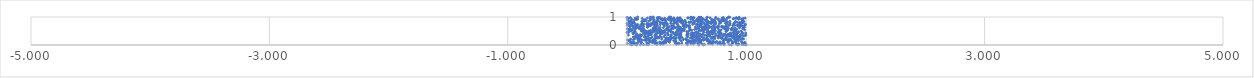
| Category | Series 0 |
|---|---|
| 0.6395549187252131 | 0.001 |
| 0.9310848672716872 | 0.002 |
| 0.9982187276434067 | 0.003 |
| 0.6012883840507545 | 0.004 |
| 0.04014197229621019 | 0.005 |
| 0.8748507245919236 | 0.006 |
| 0.08088517814818463 | 0.007 |
| 0.8154413860012517 | 0.008 |
| 0.8605284118616594 | 0.009 |
| 0.07628825915491433 | 0.01 |
| 0.11141022182324822 | 0.011 |
| 0.5068996280072336 | 0.012 |
| 0.1648344174627362 | 0.013 |
| 0.9665744751295906 | 0.014 |
| 0.1382032721908052 | 0.015 |
| 0.04223442895374796 | 0.016 |
| 0.18097360829767317 | 0.017 |
| 0.9742194430497847 | 0.018 |
| 0.9960851772762854 | 0.019 |
| 0.9811782340766644 | 0.02 |
| 0.6496849309165537 | 0.021 |
| 0.9193569184805348 | 0.022 |
| 0.25334508138845135 | 0.023 |
| 0.02981359307184772 | 0.024 |
| 0.7851436814782091 | 0.025 |
| 0.2807134976208202 | 0.026 |
| 0.9391021248131862 | 0.027 |
| 0.3016175500622472 | 0.028 |
| 0.9773512443753082 | 0.029 |
| 0.07931502166857785 | 0.03 |
| 0.556216024078836 | 0.031 |
| 0.4194814433675026 | 0.032 |
| 0.715975852775206 | 0.033 |
| 0.06179237089372924 | 0.034 |
| 0.9683378387305361 | 0.035 |
| 0.4139801656038691 | 0.036 |
| 0.25037345745661665 | 0.037 |
| 0.049797369471484165 | 0.038 |
| 0.41332417344475536 | 0.039 |
| 0.5988523106841044 | 0.04 |
| 0.7608491718158467 | 0.041 |
| 0.04943939275445175 | 0.042 |
| 0.7973265641790036 | 0.043 |
| 0.4375115468829375 | 0.044 |
| 0.9329117260293902 | 0.045 |
| 0.23537873245244534 | 0.046 |
| 0.5352460393366723 | 0.047 |
| 0.715892489913357 | 0.048 |
| 0.002405218209851512 | 0.049 |
| 0.6859869116301182 | 0.05 |
| 0.1783027727551455 | 0.051 |
| 0.4078578606921214 | 0.052 |
| 0.8141199057326022 | 0.053 |
| 0.8846974862135012 | 0.054 |
| 0.6252510479841711 | 0.055 |
| 0.28819809942706165 | 0.056 |
| 0.8139209923007339 | 0.057 |
| 0.9694759012288868 | 0.058 |
| 0.7700459021245795 | 0.059 |
| 0.9724609045760437 | 0.06 |
| 0.23368429750318487 | 0.061 |
| 0.5942851697361076 | 0.062 |
| 0.6861573832308311 | 0.063 |
| 0.7048602059146223 | 0.064 |
| 0.45990905691922024 | 0.065 |
| 0.7053683677320601 | 0.066 |
| 0.9149765791785728 | 0.067 |
| 0.4968846486621923 | 0.068 |
| 0.280671708900336 | 0.069 |
| 0.9735447370580133 | 0.07 |
| 0.43087415789896577 | 0.071 |
| 0.0594187252914663 | 0.072 |
| 0.25197872444667224 | 0.073 |
| 0.08868910783655104 | 0.074 |
| 0.25234228503677814 | 0.075 |
| 0.31300521075153687 | 0.076 |
| 0.7740774423209505 | 0.077 |
| 0.8861991284111324 | 0.078 |
| 0.7774398371507889 | 0.079 |
| 0.16489169406309057 | 0.08 |
| 0.2943854967665104 | 0.081 |
| 0.5676430077436584 | 0.082 |
| 0.32515032120642584 | 0.083 |
| 0.031074622306497268 | 0.084 |
| 0.12279866285688767 | 0.085 |
| 0.7023080361508347 | 0.086 |
| 0.9869063489259365 | 0.087 |
| 0.4039398090758105 | 0.088 |
| 0.30519437286142115 | 0.089 |
| 0.9884308449080533 | 0.09 |
| 0.5106777248199883 | 0.091 |
| 0.21135115733213328 | 0.092 |
| 0.061466796960240266 | 0.093 |
| 0.8878564232653134 | 0.094 |
| 0.41182504077114135 | 0.095 |
| 0.3094026853496852 | 0.096 |
| 0.7423342141507401 | 0.097 |
| 0.11786290024941193 | 0.098 |
| 0.8463682304805973 | 0.099 |
| 0.05300553476225556 | 0.1 |
| 0.7368297410736497 | 0.101 |
| 0.5109250226090711 | 0.102 |
| 0.3564816763772468 | 0.103 |
| 0.7114793620909686 | 0.104 |
| 0.6175359919448731 | 0.105 |
| 0.9620550851207817 | 0.106 |
| 0.8491052324481466 | 0.107 |
| 0.2754342731209991 | 0.108 |
| 0.19337030178288273 | 0.109 |
| 0.30539739466167726 | 0.11 |
| 0.35306547610450967 | 0.111 |
| 0.7118813021916045 | 0.112 |
| 0.7803495675415976 | 0.113 |
| 0.7220844024835547 | 0.114 |
| 0.532748150097891 | 0.115 |
| 0.9159408477509404 | 0.116 |
| 0.8067779688069894 | 0.117 |
| 0.21524758409457956 | 0.118 |
| 0.23174501253191493 | 0.119 |
| 0.3547256039503738 | 0.12 |
| 0.03219751268669391 | 0.121 |
| 0.6103386769420509 | 0.122 |
| 0.5231799574935321 | 0.123 |
| 0.548172980986583 | 0.124 |
| 0.7527509322401276 | 0.125 |
| 0.3294980982583624 | 0.126 |
| 0.5589251221622763 | 0.127 |
| 0.6933793474768469 | 0.128 |
| 0.3147374457022064 | 0.129 |
| 0.5406324346796556 | 0.13 |
| 0.21650408556395828 | 0.131 |
| 0.5799422404948353 | 0.132 |
| 0.9608470414033518 | 0.133 |
| 0.09949658123151439 | 0.134 |
| 0.22253961588362048 | 0.135 |
| 0.9043498555629229 | 0.136 |
| 0.4082000097416266 | 0.137 |
| 0.7226346786462091 | 0.138 |
| 0.020839868958012264 | 0.139 |
| 0.8070385898737849 | 0.14 |
| 0.32272468908206287 | 0.141 |
| 0.5612216478253415 | 0.142 |
| 0.10154760366380211 | 0.143 |
| 0.4564234341331902 | 0.144 |
| 0.6715439479526928 | 0.145 |
| 0.6215065034940336 | 0.146 |
| 0.8502632109030541 | 0.147 |
| 0.8775179788591432 | 0.148 |
| 0.5241679415987878 | 0.149 |
| 0.6905350320056689 | 0.15 |
| 0.3361386562967804 | 0.151 |
| 0.19055941271391774 | 0.152 |
| 0.23973261017425318 | 0.153 |
| 0.10256186760070551 | 0.154 |
| 0.1622226207948091 | 0.155 |
| 0.39134894498145234 | 0.156 |
| 0.21399374323488052 | 0.157 |
| 0.014785502257189775 | 0.158 |
| 0.5061539633591291 | 0.159 |
| 0.5970062077557133 | 0.16 |
| 0.31891323975442076 | 0.161 |
| 0.40433006447718445 | 0.162 |
| 0.16000951553755238 | 0.163 |
| 0.18020148001281855 | 0.164 |
| 0.9377267813952599 | 0.165 |
| 0.5056831728019332 | 0.166 |
| 0.6178578179905749 | 0.167 |
| 0.8597505225674107 | 0.168 |
| 0.8423755069957324 | 0.169 |
| 0.5106485857013747 | 0.17 |
| 0.21847388606411255 | 0.171 |
| 0.643712223633878 | 0.172 |
| 0.6161869000522311 | 0.173 |
| 0.6773474360764032 | 0.174 |
| 0.12720496899049938 | 0.175 |
| 0.1444380950068771 | 0.176 |
| 0.9330021256906428 | 0.177 |
| 0.35343350241229865 | 0.178 |
| 0.849550740156674 | 0.179 |
| 0.9284493615800176 | 0.18 |
| 0.004393083375828666 | 0.181 |
| 0.0921628714469076 | 0.182 |
| 0.5711492717815835 | 0.183 |
| 0.6843904878303557 | 0.184 |
| 0.44350655122376936 | 0.185 |
| 0.8311952546558944 | 0.186 |
| 0.0530772209405862 | 0.187 |
| 0.9043024789936736 | 0.188 |
| 0.35778420451363957 | 0.189 |
| 0.36440882551868725 | 0.19 |
| 0.8488918863529484 | 0.191 |
| 0.8157814833670053 | 0.192 |
| 0.5518697218166232 | 0.193 |
| 0.6337168979686352 | 0.194 |
| 0.23209594073935536 | 0.195 |
| 0.6119743240124649 | 0.196 |
| 0.4963794970624189 | 0.197 |
| 0.47276269290726114 | 0.198 |
| 0.09278552612931501 | 0.199 |
| 0.9135477864355651 | 0.2 |
| 0.16173466297252914 | 0.201 |
| 0.8661479703523546 | 0.202 |
| 0.3644549566561549 | 0.203 |
| 0.22735941008024574 | 0.204 |
| 0.9180299991084224 | 0.205 |
| 0.6586015663248166 | 0.206 |
| 0.09814083021640241 | 0.207 |
| 0.291524257582375 | 0.208 |
| 0.8220994955008873 | 0.209 |
| 0.9032433299705044 | 0.21 |
| 0.029985201190475763 | 0.211 |
| 0.8651057229814595 | 0.212 |
| 0.3549169383817131 | 0.213 |
| 0.9775731925615977 | 0.214 |
| 0.34243448142055444 | 0.215 |
| 0.9557886311969502 | 0.216 |
| 0.5967302441219914 | 0.217 |
| 0.6729305946693988 | 0.218 |
| 0.9088428015428529 | 0.219 |
| 0.06364596739235473 | 0.22 |
| 0.9334659698258724 | 0.221 |
| 0.49350585055954954 | 0.222 |
| 0.112190564649429 | 0.223 |
| 0.406429264542164 | 0.224 |
| 0.3494955380163385 | 0.225 |
| 0.7358744395188975 | 0.226 |
| 0.8229787940660571 | 0.227 |
| 0.32604507350087586 | 0.228 |
| 0.2355392226361538 | 0.229 |
| 0.1866484314937107 | 0.23 |
| 0.37399822163643415 | 0.231 |
| 0.6727157608389196 | 0.232 |
| 0.7070397863237047 | 0.233 |
| 0.7939941207686685 | 0.234 |
| 0.19893335867064532 | 0.235 |
| 0.17802661016971721 | 0.236 |
| 0.5819760732417913 | 0.237 |
| 0.10273041507618863 | 0.238 |
| 0.4111254923554558 | 0.239 |
| 0.7237461563370844 | 0.24 |
| 0.9677924011728322 | 0.241 |
| 0.7995051619965114 | 0.242 |
| 0.33072777644722207 | 0.243 |
| 0.7195017233619586 | 0.244 |
| 0.6063071224906124 | 0.245 |
| 0.0882819288804002 | 0.246 |
| 0.35576818131114807 | 0.247 |
| 0.4401291711005555 | 0.248 |
| 0.2521171172573988 | 0.249 |
| 0.5315685727266941 | 0.25 |
| 0.2678532983028359 | 0.251 |
| 0.40975717741747253 | 0.252 |
| 0.7661154222996744 | 0.253 |
| 0.25677429918563244 | 0.254 |
| 0.3738510846356532 | 0.255 |
| 0.5526069660926117 | 0.256 |
| 0.33154746265459145 | 0.257 |
| 0.885954612930489 | 0.258 |
| 0.15983629787513742 | 0.259 |
| 0.4345695896988272 | 0.26 |
| 0.09053230282300562 | 0.261 |
| 0.916860083682809 | 0.262 |
| 0.6455407345463323 | 0.263 |
| 0.8351979906791235 | 0.264 |
| 0.5446423657392994 | 0.265 |
| 0.7833098215323591 | 0.266 |
| 0.4611812379770398 | 0.267 |
| 0.44720427264703966 | 0.268 |
| 0.9191407415922531 | 0.269 |
| 0.3933975662868 | 0.27 |
| 0.2697050233334425 | 0.271 |
| 0.8958350411359535 | 0.272 |
| 0.2419263329695137 | 0.273 |
| 0.39105709835565383 | 0.274 |
| 0.9383274220594119 | 0.275 |
| 0.20949154938395587 | 0.276 |
| 0.7357766321024545 | 0.277 |
| 0.2702507946358367 | 0.278 |
| 0.06652699962491637 | 0.279 |
| 0.2876228498566016 | 0.28 |
| 0.583385923077128 | 0.281 |
| 0.9427843511446605 | 0.282 |
| 0.05222694587951637 | 0.283 |
| 0.7157902330153656 | 0.284 |
| 0.061333105666625864 | 0.285 |
| 0.7254407720845546 | 0.286 |
| 0.6713781821574328 | 0.287 |
| 0.5077331554108924 | 0.288 |
| 0.7660708622010118 | 0.289 |
| 0.6287237600231991 | 0.29 |
| 0.8314519514248768 | 0.291 |
| 0.589494858709051 | 0.292 |
| 0.1462213680082789 | 0.293 |
| 0.1472755567531675 | 0.294 |
| 0.5666087766909531 | 0.295 |
| 0.5646986403730799 | 0.296 |
| 0.9326466093237052 | 0.297 |
| 0.253019213717267 | 0.298 |
| 0.31020928197497377 | 0.299 |
| 0.11208286225451636 | 0.3 |
| 0.11332138008849368 | 0.301 |
| 0.1565696193509245 | 0.302 |
| 0.24718346881089592 | 0.303 |
| 0.5585033074128138 | 0.304 |
| 0.9272547181628429 | 0.305 |
| 0.3653995803461998 | 0.306 |
| 0.6734905670100707 | 0.307 |
| 0.7663791719798431 | 0.308 |
| 0.6966736515000609 | 0.309 |
| 0.8557402967043126 | 0.31 |
| 0.5051221059270471 | 0.311 |
| 0.2769907718429395 | 0.312 |
| 0.6181368113633234 | 0.313 |
| 0.4474798911450415 | 0.314 |
| 0.9520433226500807 | 0.315 |
| 0.09040718332401876 | 0.316 |
| 0.7821048194997197 | 0.317 |
| 0.8959300066283057 | 0.318 |
| 0.6959986958848429 | 0.319 |
| 0.881218487461181 | 0.32 |
| 0.9004743502599184 | 0.321 |
| 0.8023003046938714 | 0.322 |
| 0.545518193092118 | 0.323 |
| 0.44798251767297226 | 0.324 |
| 0.17638973878708764 | 0.325 |
| 0.8085372113184891 | 0.326 |
| 0.8304115500157596 | 0.327 |
| 0.8667634079638098 | 0.328 |
| 0.9456003684838314 | 0.329 |
| 0.23340677461315307 | 0.33 |
| 0.98714933448693 | 0.331 |
| 0.6034874174481242 | 0.332 |
| 0.4148814681949712 | 0.333 |
| 0.7654303828768467 | 0.334 |
| 0.974141534060887 | 0.335 |
| 0.7443907022553364 | 0.336 |
| 0.18013667917085818 | 0.337 |
| 0.08178557139289133 | 0.338 |
| 0.37069757272519166 | 0.339 |
| 0.09545342668521672 | 0.34 |
| 0.8742310295368723 | 0.341 |
| 0.671748225940215 | 0.342 |
| 0.07626587737160007 | 0.343 |
| 0.4403907627126967 | 0.344 |
| 0.567476994233713 | 0.345 |
| 0.12537845205813292 | 0.346 |
| 0.5087293335716286 | 0.347 |
| 0.5521938489649139 | 0.348 |
| 0.9464028726782525 | 0.349 |
| 0.9178067715344917 | 0.35 |
| 0.011955551109073426 | 0.351 |
| 0.43124790326715345 | 0.352 |
| 0.6535768806434158 | 0.353 |
| 0.5356776313469462 | 0.354 |
| 0.9975778000294897 | 0.355 |
| 0.5010245488097596 | 0.356 |
| 0.8733680776686181 | 0.357 |
| 0.31880629946237615 | 0.358 |
| 0.45008120061692714 | 0.359 |
| 0.899241791514591 | 0.36 |
| 0.8420101760036794 | 0.361 |
| 0.34129769574843083 | 0.362 |
| 0.5575293869102662 | 0.363 |
| 0.5844407619404424 | 0.364 |
| 0.2043698992030455 | 0.365 |
| 0.45176407129972806 | 0.366 |
| 0.40549751352516106 | 0.367 |
| 0.6927128385436708 | 0.368 |
| 0.36967944106831363 | 0.369 |
| 0.23741612640321563 | 0.37 |
| 0.19229429270448384 | 0.371 |
| 0.11112932596617564 | 0.372 |
| 0.9533024855951122 | 0.373 |
| 0.3450678502969423 | 0.374 |
| 0.6344743381717122 | 0.375 |
| 0.8111591407741535 | 0.376 |
| 0.8468114505173411 | 0.377 |
| 0.777018015609135 | 0.378 |
| 0.6347207742837573 | 0.379 |
| 0.9004504196982197 | 0.38 |
| 0.40553058166834954 | 0.381 |
| 0.5479603899337818 | 0.382 |
| 0.7445660547807811 | 0.383 |
| 0.9182233341627363 | 0.384 |
| 0.6845884922756488 | 0.385 |
| 0.14811616672887928 | 0.386 |
| 0.5507954474864022 | 0.387 |
| 0.2799121136819306 | 0.388 |
| 0.5091022272479836 | 0.389 |
| 0.8241286489161219 | 0.39 |
| 0.1970852503061492 | 0.391 |
| 0.43722172636592416 | 0.392 |
| 0.15634555216965995 | 0.393 |
| 0.7882685649663198 | 0.394 |
| 0.5075270057544927 | 0.395 |
| 0.6132450508435306 | 0.396 |
| 0.7160285573429371 | 0.397 |
| 0.41709062301949684 | 0.398 |
| 0.39746246968688637 | 0.399 |
| 0.8982221224531748 | 0.4 |
| 0.05436376064241755 | 0.401 |
| 0.7163008790970389 | 0.402 |
| 0.2951359011716551 | 0.403 |
| 0.8586426757860284 | 0.404 |
| 0.07997482041494874 | 0.405 |
| 0.28261924043026876 | 0.406 |
| 0.17653902927922582 | 0.407 |
| 0.7124790987900146 | 0.408 |
| 0.5149636077584209 | 0.409 |
| 0.7802372301179449 | 0.41 |
| 0.28481511977897833 | 0.411 |
| 0.6883111411386432 | 0.412 |
| 0.0511161049324812 | 0.413 |
| 0.7720763094606466 | 0.414 |
| 0.6001747027459223 | 0.415 |
| 0.9695432091737995 | 0.416 |
| 0.2562505245430481 | 0.417 |
| 0.24437240443091401 | 0.418 |
| 0.5631810628892144 | 0.419 |
| 0.20176082035892406 | 0.42 |
| 0.2989193264402986 | 0.421 |
| 0.9225934073546054 | 0.422 |
| 0.5636544763045815 | 0.423 |
| 0.7908731412208955 | 0.424 |
| 0.8696264680044601 | 0.425 |
| 0.9290417389704572 | 0.426 |
| 0.9950858395908091 | 0.427 |
| 0.5407982936070541 | 0.428 |
| 0.14600442768419197 | 0.429 |
| 0.44982019481084456 | 0.43 |
| 0.8908132600038879 | 0.431 |
| 0.34003483104850507 | 0.432 |
| 0.9203428672427163 | 0.433 |
| 0.003599222328199092 | 0.434 |
| 0.38368225709575365 | 0.435 |
| 0.27112607725096616 | 0.436 |
| 0.587795515967676 | 0.437 |
| 0.5499129676779554 | 0.438 |
| 0.2817811109448829 | 0.439 |
| 0.4538486861620973 | 0.44 |
| 0.13510646230212242 | 0.441 |
| 0.058642915739257506 | 0.442 |
| 0.00033839330926177524 | 0.443 |
| 0.6685047469665801 | 0.444 |
| 0.7325071922558722 | 0.445 |
| 0.7654831049609724 | 0.446 |
| 0.3193857434879491 | 0.447 |
| 0.19876816275986697 | 0.448 |
| 0.16262343719133288 | 0.449 |
| 0.15213171457835872 | 0.45 |
| 0.385679075229022 | 0.451 |
| 0.6438292599762862 | 0.452 |
| 0.7107399773716795 | 0.453 |
| 0.966629625417199 | 0.454 |
| 0.5790151031445043 | 0.455 |
| 0.4098531374031582 | 0.456 |
| 0.7195735716173753 | 0.457 |
| 0.42514296934474916 | 0.458 |
| 0.014748060476214131 | 0.459 |
| 0.6799729458069164 | 0.46 |
| 0.6904129213399339 | 0.461 |
| 0.1629890144596584 | 0.462 |
| 0.29883213663319164 | 0.463 |
| 0.8999257620763175 | 0.464 |
| 0.8958322562587409 | 0.465 |
| 0.22297963642124485 | 0.466 |
| 0.2137973720739874 | 0.467 |
| 0.5829654497289547 | 0.468 |
| 0.2143843436365639 | 0.469 |
| 0.0019171117290457396 | 0.47 |
| 0.01640442298989042 | 0.471 |
| 0.1753565723379198 | 0.472 |
| 0.7641749169466285 | 0.473 |
| 0.1917151747875453 | 0.474 |
| 0.93810045125596 | 0.475 |
| 0.5017462362982836 | 0.476 |
| 0.27721839562890804 | 0.477 |
| 0.01281905731486499 | 0.478 |
| 0.37383094691885865 | 0.479 |
| 0.2577538607018024 | 0.48 |
| 0.36527502366786735 | 0.481 |
| 0.068347466770737 | 0.482 |
| 0.3105971303797709 | 0.483 |
| 0.2821996745312788 | 0.484 |
| 0.1484952246299831 | 0.485 |
| 0.7025833392710812 | 0.486 |
| 0.8340970159499962 | 0.487 |
| 0.13928490998143406 | 0.488 |
| 0.8303419956826392 | 0.489 |
| 0.30222523107966526 | 0.49 |
| 0.18237247215481933 | 0.491 |
| 0.9577432513457312 | 0.492 |
| 0.3150471610352418 | 0.493 |
| 0.03665380991662237 | 0.494 |
| 0.5175374642686525 | 0.495 |
| 0.1573277398249896 | 0.496 |
| 0.916889918997398 | 0.497 |
| 0.29794236397686247 | 0.498 |
| 0.18435861499466832 | 0.499 |
| 0.27452528841017776 | 0.5 |
| 0.2568613030112993 | 0.501 |
| 0.7786476518866864 | 0.502 |
| 0.6401102015682069 | 0.503 |
| 0.3492191561971556 | 0.504 |
| 0.12123993239162778 | 0.505 |
| 0.6758133627519629 | 0.506 |
| 0.0634529239834486 | 0.507 |
| 0.4542613140155789 | 0.508 |
| 0.7396303677317174 | 0.509 |
| 0.3129689312415411 | 0.51 |
| 0.7773015739383908 | 0.511 |
| 0.23739285264383758 | 0.512 |
| 0.6217802864831085 | 0.513 |
| 0.4399083664051041 | 0.514 |
| 0.6033669385763927 | 0.515 |
| 0.22329746005768503 | 0.516 |
| 0.46644088891234947 | 0.517 |
| 0.4244847639906574 | 0.518 |
| 0.4779391352451091 | 0.519 |
| 0.11947478769954922 | 0.52 |
| 0.2362110422445124 | 0.521 |
| 0.7145241686357324 | 0.522 |
| 0.3583469311116012 | 0.523 |
| 0.1992564556928783 | 0.524 |
| 0.8983431314144155 | 0.525 |
| 0.7329925416357217 | 0.526 |
| 0.42144803582698964 | 0.527 |
| 0.13325786179765797 | 0.528 |
| 0.84463944979644 | 0.529 |
| 0.6121759485996532 | 0.53 |
| 0.5424382612042715 | 0.531 |
| 0.47825671271558146 | 0.532 |
| 0.8357734915765401 | 0.533 |
| 0.8776712499121947 | 0.534 |
| 0.4380482780309338 | 0.535 |
| 0.24544159297099155 | 0.536 |
| 0.6473775028522438 | 0.537 |
| 0.33765596559446565 | 0.538 |
| 0.7892881557457164 | 0.539 |
| 0.531893178173144 | 0.54 |
| 0.6392942799919121 | 0.541 |
| 0.25202152760646634 | 0.542 |
| 0.9859895199344776 | 0.543 |
| 0.03628196944895612 | 0.544 |
| 0.45995939811015996 | 0.545 |
| 0.6495408483092756 | 0.546 |
| 0.2815787463687881 | 0.547 |
| 0.8380868591680972 | 0.548 |
| 0.6474108538207839 | 0.549 |
| 0.36473292375112987 | 0.55 |
| 0.22229949464836884 | 0.551 |
| 0.5668360188294573 | 0.552 |
| 0.027217517065209695 | 0.553 |
| 0.7306357295763212 | 0.554 |
| 0.04433319103317923 | 0.555 |
| 0.5269909785750875 | 0.556 |
| 0.1421191881079057 | 0.557 |
| 0.8751156906631192 | 0.558 |
| 0.018065318860081003 | 0.559 |
| 0.4385102264916282 | 0.56 |
| 0.8249825510317458 | 0.561 |
| 0.9210822154583961 | 0.562 |
| 0.4686621589536927 | 0.563 |
| 0.32954177795165096 | 0.564 |
| 0.3382083109652294 | 0.565 |
| 0.9110805307704429 | 0.566 |
| 0.345634326683817 | 0.567 |
| 0.47533843564012457 | 0.568 |
| 0.8244753482490456 | 0.569 |
| 0.4806706709465687 | 0.57 |
| 0.45513675551901933 | 0.571 |
| 0.6579783898565353 | 0.572 |
| 0.006216981187325943 | 0.573 |
| 0.6807733396097284 | 0.574 |
| 0.23486823182841954 | 0.575 |
| 0.7373378908264511 | 0.576 |
| 0.06828863665062412 | 0.577 |
| 0.5826183718152201 | 0.578 |
| 0.2644635117012101 | 0.579 |
| 0.3752318939185516 | 0.58 |
| 0.002675200913887732 | 0.581 |
| 0.8739742760618039 | 0.582 |
| 0.632240582570969 | 0.583 |
| 0.9700334758229819 | 0.584 |
| 0.06561917433378228 | 0.585 |
| 0.7643604216742884 | 0.586 |
| 0.21885178418924722 | 0.587 |
| 0.8823621483293822 | 0.588 |
| 0.11087083433349332 | 0.589 |
| 0.1016500727427665 | 0.59 |
| 0.3902591467397307 | 0.591 |
| 0.23826248930520955 | 0.592 |
| 0.0737523059745494 | 0.593 |
| 0.66177094938153 | 0.594 |
| 0.8250505334086163 | 0.595 |
| 0.6016809603047282 | 0.596 |
| 0.12947700349141256 | 0.597 |
| 0.8494067711234523 | 0.598 |
| 0.42567989083421864 | 0.599 |
| 0.5875300620003768 | 0.6 |
| 0.9072141958458186 | 0.601 |
| 0.3376961339417399 | 0.602 |
| 0.243319949077353 | 0.603 |
| 0.43720925700606916 | 0.604 |
| 0.844582941410232 | 0.605 |
| 0.8072770958635348 | 0.606 |
| 0.6691356014482355 | 0.607 |
| 0.2234223673973399 | 0.608 |
| 0.8850133750421468 | 0.609 |
| 0.10946036171226514 | 0.61 |
| 0.7104084502974828 | 0.611 |
| 0.9437195347294588 | 0.612 |
| 0.7316397004920632 | 0.613 |
| 0.344073730409183 | 0.614 |
| 0.8300722513850555 | 0.615 |
| 0.40556439638805064 | 0.616 |
| 0.37694819294037607 | 0.617 |
| 0.9831315521062145 | 0.618 |
| 0.3048074152897824 | 0.619 |
| 0.10224008033125798 | 0.62 |
| 0.5213469366199077 | 0.621 |
| 0.642061865040627 | 0.622 |
| 0.0529238774187889 | 0.623 |
| 0.6492543477830901 | 0.624 |
| 0.827072106916362 | 0.625 |
| 0.27695209432290435 | 0.626 |
| 0.7647697465370886 | 0.627 |
| 0.44946474870528275 | 0.628 |
| 0.08453068866991986 | 0.629 |
| 0.524968776120131 | 0.63 |
| 0.39038006715642826 | 0.631 |
| 0.1701686536753596 | 0.632 |
| 0.6882425918338454 | 0.633 |
| 0.9805395619752542 | 0.634 |
| 0.3942366548407541 | 0.635 |
| 0.8201677358583049 | 0.636 |
| 0.44022031217425805 | 0.637 |
| 0.8067715512435302 | 0.638 |
| 0.49437412634852007 | 0.639 |
| 0.11171658632794346 | 0.64 |
| 0.5738288839896917 | 0.641 |
| 0.47714913574025464 | 0.642 |
| 0.23527240335248856 | 0.643 |
| 0.42355223729078073 | 0.644 |
| 0.5225109675746766 | 0.645 |
| 0.7052363815690786 | 0.646 |
| 0.6230220367368359 | 0.647 |
| 0.6584668878143974 | 0.648 |
| 0.971819892497822 | 0.649 |
| 0.6636382417663069 | 0.65 |
| 0.6437713201998123 | 0.651 |
| 0.7462370477008441 | 0.652 |
| 0.7662743625489804 | 0.653 |
| 0.8381707231049966 | 0.654 |
| 0.10406246030590649 | 0.655 |
| 0.027035016408094137 | 0.656 |
| 0.7913012172835087 | 0.657 |
| 0.35376529725801675 | 0.658 |
| 0.022891899666602766 | 0.659 |
| 0.13985598785663145 | 0.66 |
| 0.8025650433674253 | 0.661 |
| 0.17676807934278793 | 0.662 |
| 0.7997907055066793 | 0.663 |
| 0.6153433588128286 | 0.664 |
| 0.5951805311740526 | 0.665 |
| 0.9795953510424161 | 0.666 |
| 0.4281161233733095 | 0.667 |
| 0.9502471213022723 | 0.668 |
| 0.23345252679345674 | 0.669 |
| 0.9672996039000924 | 0.67 |
| 0.2511279873353006 | 0.671 |
| 0.18247168386695245 | 0.672 |
| 0.7304835541973169 | 0.673 |
| 0.6890257108669546 | 0.674 |
| 0.2558145692436653 | 0.675 |
| 0.31279378567042215 | 0.676 |
| 0.9346021005728624 | 0.677 |
| 0.6185921541831384 | 0.678 |
| 0.6066520750667276 | 0.679 |
| 0.07121717340475386 | 0.68 |
| 0.05496697488775293 | 0.681 |
| 0.9311036038284692 | 0.682 |
| 0.3802063801604716 | 0.683 |
| 0.3896620623861955 | 0.684 |
| 0.9843392548668639 | 0.685 |
| 0.7240469976139066 | 0.686 |
| 0.5183907458013113 | 0.687 |
| 0.23372787310749532 | 0.688 |
| 0.7662202669604742 | 0.689 |
| 0.46998506610447865 | 0.69 |
| 0.3737448678611056 | 0.691 |
| 0.17295679424381438 | 0.692 |
| 0.5249333875075941 | 0.693 |
| 0.3341076865924385 | 0.694 |
| 0.8876812985248591 | 0.695 |
| 0.5039820077973863 | 0.696 |
| 0.8319255168737866 | 0.697 |
| 0.19915483322766347 | 0.698 |
| 0.9465434566847254 | 0.699 |
| 0.04441405897115369 | 0.7 |
| 0.853037776256244 | 0.701 |
| 0.12362489609521365 | 0.702 |
| 0.923732426728117 | 0.703 |
| 0.9029211750248355 | 0.704 |
| 0.1886565651157851 | 0.705 |
| 0.18674278870647487 | 0.706 |
| 0.0014212466694280002 | 0.707 |
| 0.42946167597602336 | 0.708 |
| 0.48013783270825583 | 0.709 |
| 0.9904481953995559 | 0.71 |
| 0.954234306380398 | 0.711 |
| 0.03261191115108075 | 0.712 |
| 0.6730556156223974 | 0.713 |
| 0.19454025717883994 | 0.714 |
| 0.07330343457160116 | 0.715 |
| 0.6768127756414964 | 0.716 |
| 0.2346013469152557 | 0.717 |
| 0.08402972755702354 | 0.718 |
| 0.18459429177292908 | 0.719 |
| 0.8618410171739934 | 0.72 |
| 0.23696483616714847 | 0.721 |
| 0.61218272242154 | 0.722 |
| 0.6567410343807724 | 0.723 |
| 0.1754088406311175 | 0.724 |
| 0.9338689390974717 | 0.725 |
| 0.1705855483816947 | 0.726 |
| 0.11847712002806021 | 0.727 |
| 0.4727496083473004 | 0.728 |
| 0.27794388609802134 | 0.729 |
| 0.09112489124500833 | 0.73 |
| 0.30452160983484877 | 0.731 |
| 0.6268624090395468 | 0.732 |
| 0.1971420239553422 | 0.733 |
| 0.5815234436456128 | 0.734 |
| 0.0108546450399567 | 0.735 |
| 0.49113516705115257 | 0.736 |
| 0.6082120476779 | 0.737 |
| 0.6558160382742446 | 0.738 |
| 0.14151805679384333 | 0.739 |
| 0.5888344340984962 | 0.74 |
| 0.5514368763308805 | 0.741 |
| 0.9928116570117194 | 0.742 |
| 0.21884712606000112 | 0.743 |
| 0.8333498584609056 | 0.744 |
| 0.4723230267106142 | 0.745 |
| 0.9520034762557005 | 0.746 |
| 0.33906886303001826 | 0.747 |
| 0.612346554889201 | 0.748 |
| 0.4197433319012326 | 0.749 |
| 0.8944755972317295 | 0.75 |
| 0.7325182171847321 | 0.751 |
| 0.16647230809669167 | 0.752 |
| 0.21008399586945803 | 0.753 |
| 0.3370067690804873 | 0.754 |
| 0.3164204283110086 | 0.755 |
| 0.25257066354490576 | 0.756 |
| 0.5557115340778964 | 0.757 |
| 0.12865546355505397 | 0.758 |
| 0.9396367449812176 | 0.759 |
| 0.743888902164678 | 0.76 |
| 0.7075385237292754 | 0.761 |
| 0.9471195578012206 | 0.762 |
| 0.4699930402058402 | 0.763 |
| 0.3916992357892467 | 0.764 |
| 0.20106255442025922 | 0.765 |
| 0.9494912874571142 | 0.766 |
| 0.06601117139533708 | 0.767 |
| 0.7770603383641002 | 0.768 |
| 0.8648184777730069 | 0.769 |
| 0.0004265790979607331 | 0.77 |
| 0.21710460263245757 | 0.771 |
| 0.3918137129088881 | 0.772 |
| 0.1761827892677359 | 0.773 |
| 0.3667521683208145 | 0.774 |
| 0.5592718424493703 | 0.775 |
| 0.04073641027823982 | 0.776 |
| 0.015125238365606086 | 0.777 |
| 0.1257804060903286 | 0.778 |
| 0.8263781852664385 | 0.779 |
| 0.6177725398653715 | 0.78 |
| 0.9007108848490025 | 0.781 |
| 0.563178539840948 | 0.782 |
| 0.30402640275152126 | 0.783 |
| 0.9656781908186393 | 0.784 |
| 0.2978199482532582 | 0.785 |
| 0.9704805554767139 | 0.786 |
| 0.24997182725260902 | 0.787 |
| 0.8425895917687602 | 0.788 |
| 0.6904672895282321 | 0.789 |
| 0.5552600718433354 | 0.79 |
| 0.4225302621639174 | 0.791 |
| 0.237279136510946 | 0.792 |
| 0.672655012655917 | 0.793 |
| 0.9008043392978066 | 0.794 |
| 0.4568502238760671 | 0.795 |
| 0.6447202993876687 | 0.796 |
| 0.941045009060944 | 0.797 |
| 0.9659625653821416 | 0.798 |
| 0.5248284994535629 | 0.799 |
| 0.27973583643253663 | 0.8 |
| 0.7874049428179406 | 0.801 |
| 0.2234502248245368 | 0.802 |
| 0.9494078683718309 | 0.803 |
| 0.40371391411449375 | 0.804 |
| 0.49504012942330256 | 0.805 |
| 0.2291944217658669 | 0.806 |
| 0.7434718718283745 | 0.807 |
| 0.023429045562727957 | 0.808 |
| 0.05673220877994389 | 0.809 |
| 0.04536243249173255 | 0.81 |
| 0.04584672066990714 | 0.811 |
| 0.7003054599297244 | 0.812 |
| 0.9229476180009051 | 0.813 |
| 0.6323598711054749 | 0.814 |
| 0.32294155721839757 | 0.815 |
| 0.518683707861633 | 0.816 |
| 0.597992362343228 | 0.817 |
| 0.3272170411992017 | 0.818 |
| 0.27986359365627234 | 0.819 |
| 0.6858376981004642 | 0.82 |
| 0.5285568947583827 | 0.821 |
| 0.055940242438809795 | 0.822 |
| 0.7200948286724469 | 0.823 |
| 0.3946931053028918 | 0.824 |
| 0.4693189724542016 | 0.825 |
| 0.5381525197282465 | 0.826 |
| 0.447591371077536 | 0.827 |
| 0.7755401920357199 | 0.828 |
| 0.8418877106232115 | 0.829 |
| 0.7159426395990248 | 0.83 |
| 0.022568799736208844 | 0.831 |
| 0.47036241112361055 | 0.832 |
| 0.24153849895662016 | 0.833 |
| 0.4539546816186676 | 0.834 |
| 0.22260636244183873 | 0.835 |
| 0.9809830375064338 | 0.836 |
| 0.36832523754166036 | 0.837 |
| 0.6666276323129027 | 0.838 |
| 0.2531526145675709 | 0.839 |
| 0.7141953596239278 | 0.84 |
| 0.4184777008342324 | 0.841 |
| 0.030149744049369542 | 0.842 |
| 0.9103075540255766 | 0.843 |
| 0.12415689037624333 | 0.844 |
| 0.8628425359476192 | 0.845 |
| 0.9669661766154177 | 0.846 |
| 0.03234229970647573 | 0.847 |
| 0.14251674113520185 | 0.848 |
| 0.7375823134234519 | 0.849 |
| 0.7330376898630788 | 0.85 |
| 0.7813813777308108 | 0.851 |
| 0.6762960648786731 | 0.852 |
| 0.01809205827105209 | 0.853 |
| 0.8141788375078399 | 0.854 |
| 0.5763595958894888 | 0.855 |
| 0.5753490993409396 | 0.856 |
| 0.16250354956382396 | 0.857 |
| 0.03228998456683607 | 0.858 |
| 0.460941615864079 | 0.859 |
| 0.6220026062105479 | 0.86 |
| 0.258674298870022 | 0.861 |
| 0.6751095986379883 | 0.862 |
| 0.18680099941959816 | 0.863 |
| 0.48299308888917736 | 0.864 |
| 0.7277509198842103 | 0.865 |
| 0.7927822535842216 | 0.866 |
| 0.2612388950830562 | 0.867 |
| 0.806758213139359 | 0.868 |
| 0.59461110268663 | 0.869 |
| 0.012268777681819554 | 0.87 |
| 0.3235012162657873 | 0.871 |
| 0.5928026467445637 | 0.872 |
| 0.43795912609409615 | 0.873 |
| 0.3984858303417299 | 0.874 |
| 0.6105377322948105 | 0.875 |
| 0.48733062404136107 | 0.876 |
| 0.7170265315251484 | 0.877 |
| 0.9736204912193598 | 0.878 |
| 0.5573239154649524 | 0.879 |
| 0.8064859646676376 | 0.88 |
| 0.37020883853565956 | 0.881 |
| 0.14207019608143423 | 0.882 |
| 0.3731837593905708 | 0.883 |
| 0.8083045833427698 | 0.884 |
| 0.14256164542739114 | 0.885 |
| 0.8276751741896766 | 0.886 |
| 0.6604737857268823 | 0.887 |
| 0.4293044689943637 | 0.888 |
| 0.7264575511275511 | 0.889 |
| 0.5906656056640148 | 0.89 |
| 0.060513686973126646 | 0.891 |
| 0.5881812434844181 | 0.892 |
| 0.29924793329692434 | 0.893 |
| 0.19537054646603746 | 0.894 |
| 0.6198152272294631 | 0.895 |
| 0.446303568259688 | 0.896 |
| 0.6653051393487148 | 0.897 |
| 0.6499881858937707 | 0.898 |
| 0.3021702919314352 | 0.899 |
| 0.3182550387914541 | 0.9 |
| 0.22304224398328698 | 0.901 |
| 0.40327230818335247 | 0.902 |
| 0.716023396154624 | 0.903 |
| 0.6297607915158988 | 0.904 |
| 0.7098468217898135 | 0.905 |
| 0.3538641656584882 | 0.906 |
| 0.45836127267055515 | 0.907 |
| 0.15208686004939242 | 0.908 |
| 0.003202262539862999 | 0.909 |
| 0.7645325008100289 | 0.91 |
| 0.08246551681048542 | 0.911 |
| 0.22640224761631655 | 0.912 |
| 0.7945801173459863 | 0.913 |
| 0.3919241649307974 | 0.914 |
| 0.3463974006917767 | 0.915 |
| 0.962021860084075 | 0.916 |
| 0.040185575334455215 | 0.917 |
| 0.0744953814587147 | 0.918 |
| 0.9357795584971156 | 0.919 |
| 0.2973630653005249 | 0.92 |
| 0.29358654496144776 | 0.921 |
| 0.535105749540202 | 0.922 |
| 0.37654053009868194 | 0.923 |
| 0.6270811418313036 | 0.924 |
| 0.2856155535915431 | 0.925 |
| 0.19780031286960198 | 0.926 |
| 0.25886979032365487 | 0.927 |
| 0.9632284884927949 | 0.928 |
| 0.8151097513247441 | 0.929 |
| 0.08921415055169735 | 0.93 |
| 0.29547995928675397 | 0.931 |
| 0.7664900142187031 | 0.932 |
| 0.20113221111422663 | 0.933 |
| 0.5910494978632377 | 0.934 |
| 0.36621785839181464 | 0.935 |
| 0.5545144085242004 | 0.936 |
| 0.34083477100490966 | 0.937 |
| 0.4420061911962888 | 0.938 |
| 0.2542207871151795 | 0.939 |
| 0.8940622011886402 | 0.94 |
| 0.8917086625669256 | 0.941 |
| 0.6366204582592759 | 0.942 |
| 0.7430126737303517 | 0.943 |
| 0.42108939031056314 | 0.944 |
| 0.38909413743539245 | 0.945 |
| 0.9748751633489211 | 0.946 |
| 0.43320311993882277 | 0.947 |
| 0.9319696605113658 | 0.948 |
| 0.12794702736911834 | 0.949 |
| 0.9378036968206063 | 0.95 |
| 0.8404338074262246 | 0.951 |
| 0.9360189065915372 | 0.952 |
| 0.3160087479998196 | 0.953 |
| 0.4258364745440446 | 0.954 |
| 0.01345445469866513 | 0.955 |
| 0.9105592969960677 | 0.956 |
| 0.7973643698082128 | 0.957 |
| 0.2789391042239253 | 0.958 |
| 0.17121387450657244 | 0.959 |
| 0.6272984698885443 | 0.96 |
| 0.9900972040117093 | 0.961 |
| 0.8404171824378478 | 0.962 |
| 0.06824575831349 | 0.963 |
| 0.5377965929184778 | 0.964 |
| 0.5095936039946567 | 0.965 |
| 0.5132183100934012 | 0.966 |
| 0.39339680991144554 | 0.967 |
| 0.9204330193649628 | 0.968 |
| 0.42563291842867923 | 0.969 |
| 0.9167250601228984 | 0.97 |
| 0.35716073204106646 | 0.971 |
| 0.6968668241876688 | 0.972 |
| 0.669078084765921 | 0.973 |
| 0.5628414085685377 | 0.974 |
| 0.445198543667234 | 0.975 |
| 0.27467496675726044 | 0.976 |
| 0.2546890987271414 | 0.977 |
| 0.02898900423005457 | 0.978 |
| 0.6016751030446285 | 0.979 |
| 0.5543822146237706 | 0.98 |
| 0.00042644368314070924 | 0.981 |
| 0.6065074663547513 | 0.982 |
| 0.5388090906675085 | 0.983 |
| 0.26857819548782313 | 0.984 |
| 0.8071777335029594 | 0.985 |
| 0.6192167826875608 | 0.986 |
| 0.6198779255974006 | 0.987 |
| 0.7444838651976877 | 0.988 |
| 0.6108126008758354 | 0.989 |
| 0.941567581190388 | 0.99 |
| 0.5342308736016177 | 0.991 |
| 0.8618730173822865 | 0.992 |
| 0.6740283322842633 | 0.993 |
| 0.2211900055158188 | 0.994 |
| 0.21435009050472864 | 0.995 |
| 0.194747185883136 | 0.996 |
| 0.35516158108082685 | 0.997 |
| 0.36722668319551355 | 0.998 |
| 0.85276759522808 | 0.999 |
| 0.08911733470107441 | 1 |